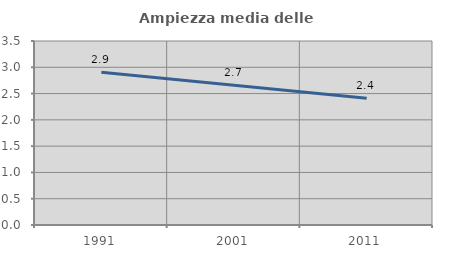
| Category | Ampiezza media delle famiglie |
|---|---|
| 1991.0 | 2.904 |
| 2001.0 | 2.659 |
| 2011.0 | 2.413 |